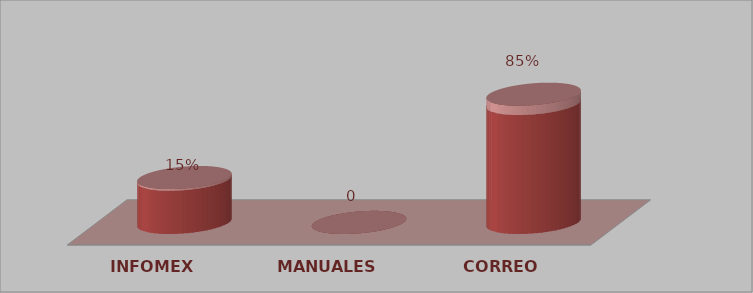
| Category | Series 0 | Series 1 |
|---|---|---|
| INFOMEX | 4 | 0.15 |
| MANUALES | 0 | 0 |
| CORREO | 11 | 0.85 |